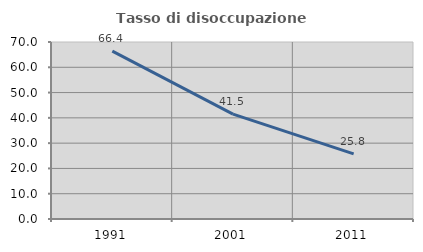
| Category | Tasso di disoccupazione giovanile  |
|---|---|
| 1991.0 | 66.39 |
| 2001.0 | 41.463 |
| 2011.0 | 25.773 |